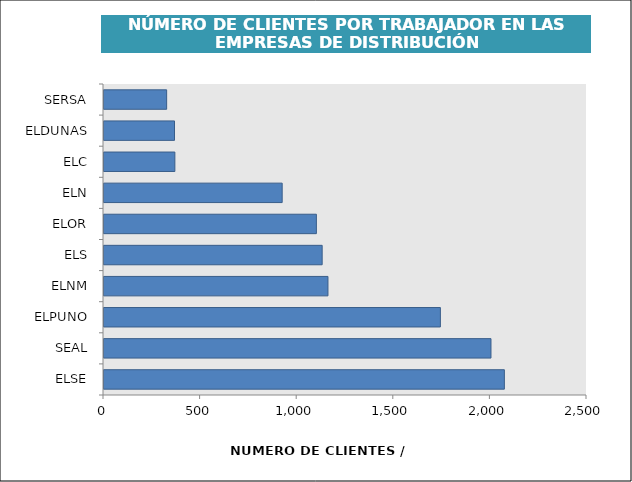
| Category | Series 0 |
|---|---|
| ELSE | 2072.299 |
| SEAL | 2003.009 |
| ELPUNO | 1741.091 |
| ELNM | 1159.205 |
| ELS | 1129.238 |
| ELOR | 1099.275 |
| ELN | 922.25 |
| ELC | 366.775 |
| ELDUNAS | 364.933 |
| SERSA | 324.25 |